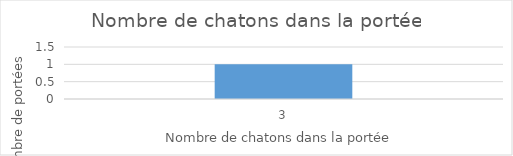
| Category | Series 0 |
|---|---|
| 3.0 | 1 |